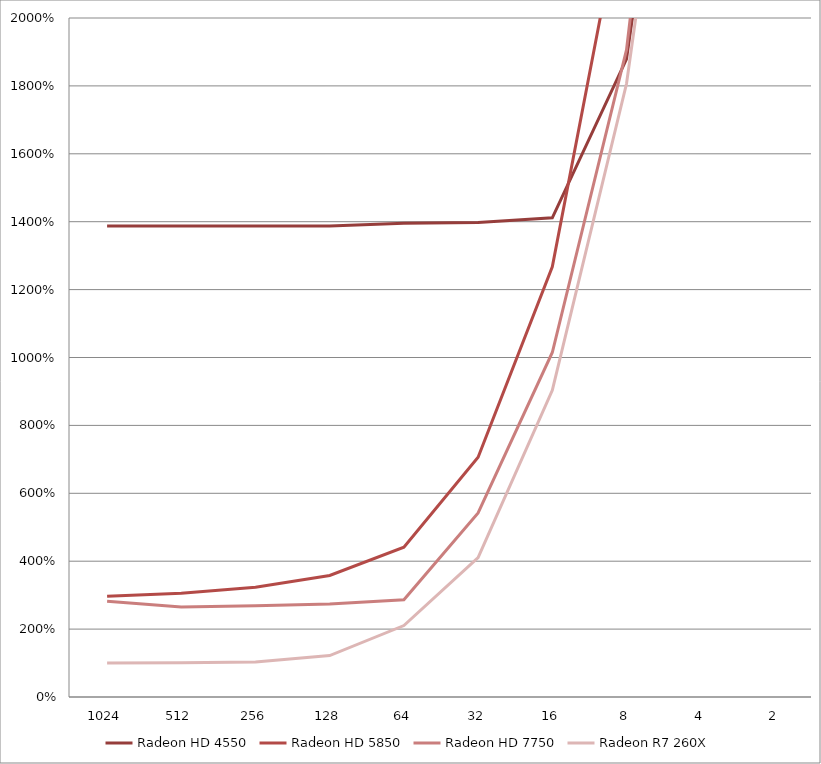
| Category | Radeon HD 4550 | Radeon HD 5850 | Radeon HD 7750 | Radeon R7 260X |
|---|---|---|---|---|
| 1024.0 | 13.874 | 2.968 | 2.821 | 1 |
| 512.0 | 13.874 | 3.053 | 2.653 | 1.011 |
| 256.0 | 13.874 | 3.232 | 2.684 | 1.032 |
| 128.0 | 13.874 | 3.579 | 2.737 | 1.221 |
| 64.0 | 13.958 | 4.411 | 2.863 | 2.105 |
| 32.0 | 13.979 | 7.063 | 5.421 | 4.105 |
| 16.0 | 14.116 | 12.674 | 10.147 | 9.032 |
| 8.0 | 18.789 | 24.021 | 19.063 | 18.063 |
| 4.0 | 34.053 | 46.979 | 37.495 | 33.632 |
| 2.0 | 65.758 | 92.021 | 74.895 | 70.663 |